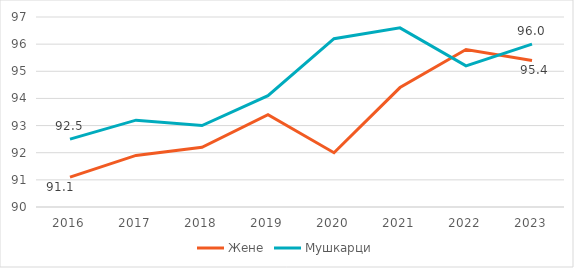
| Category | Жене | Мушкарци |
|---|---|---|
| 2016.0 | 91.1 | 92.5 |
| 2017.0 | 91.9 | 93.2 |
| 2018.0 | 92.2 | 93 |
| 2019.0 | 93.4 | 94.1 |
| 2020.0 | 92 | 96.2 |
| 2021.0 | 94.4 | 96.6 |
| 2022.0 | 95.8 | 95.2 |
| 2023.0 | 95.4 | 96 |